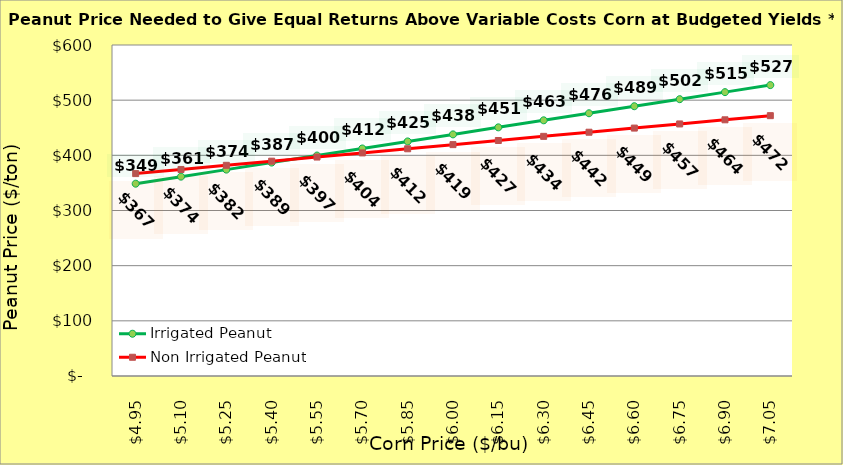
| Category | Irrigated Peanut | Non Irrigated Peanut |
|---|---|---|
| 4.9499999999999975 | 348.594 | 366.899 |
| 5.099999999999998 | 361.36 | 374.399 |
| 5.249999999999998 | 374.126 | 381.899 |
| 5.399999999999999 | 386.892 | 389.399 |
| 5.549999999999999 | 399.658 | 396.899 |
| 5.699999999999999 | 412.424 | 404.399 |
| 5.85 | 425.19 | 411.899 |
| 6.0 | 437.956 | 419.399 |
| 6.15 | 450.722 | 426.899 |
| 6.300000000000001 | 463.488 | 434.399 |
| 6.450000000000001 | 476.254 | 441.899 |
| 6.600000000000001 | 489.019 | 449.399 |
| 6.750000000000002 | 501.785 | 456.899 |
| 6.900000000000002 | 514.551 | 464.399 |
| 7.0500000000000025 | 527.317 | 471.899 |